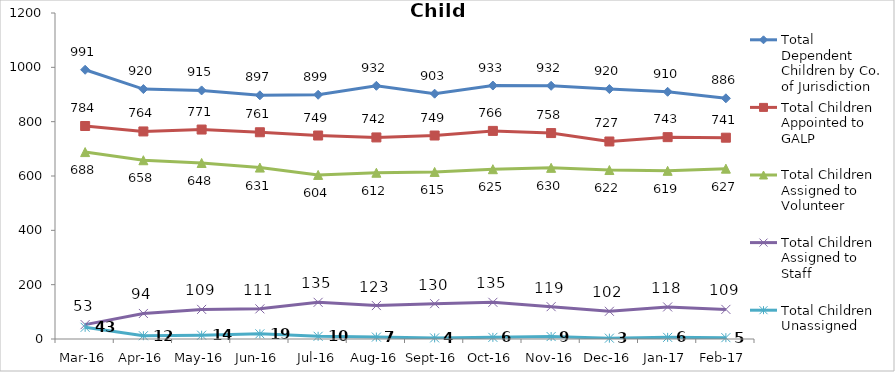
| Category | Total Dependent Children by Co. of Jurisdiction | Total Children Appointed to GALP | Total Children Assigned to Volunteer | Total Children Assigned to Staff | Total Children Unassigned |
|---|---|---|---|---|---|
| Mar-16 | 991 | 784 | 688 | 53 | 43 |
| Apr-16 | 920 | 764 | 658 | 94 | 12 |
| May-16 | 915 | 771 | 648 | 109 | 14 |
| Jun-16 | 897 | 761 | 631 | 111 | 19 |
| Jul-16 | 899 | 749 | 604 | 135 | 10 |
| Aug-16 | 932 | 742 | 612 | 123 | 7 |
| Sep-16 | 903 | 749 | 615 | 130 | 4 |
| Oct-16 | 933 | 766 | 625 | 135 | 6 |
| Nov-16 | 932 | 758 | 630 | 119 | 9 |
| Dec-16 | 920 | 727 | 622 | 102 | 3 |
| Jan-17 | 910 | 743 | 619 | 118 | 6 |
| Feb-17 | 886 | 741 | 627 | 109 | 5 |